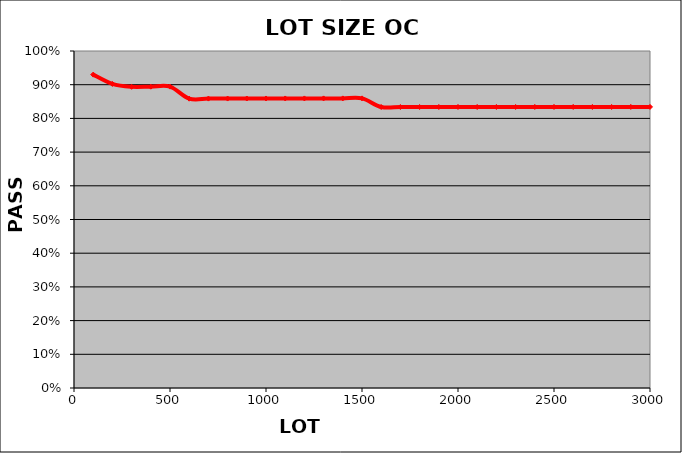
| Category | PASS
RATE |
|---|---|
| 100.0 | 0.93 |
| 200.0 | 0.902 |
| 300.0 | 0.894 |
| 400.0 | 0.894 |
| 500.0 | 0.894 |
| 600.0 | 0.859 |
| 700.0 | 0.859 |
| 800.0 | 0.859 |
| 900.0 | 0.859 |
| 1000.0 | 0.859 |
| 1100.0 | 0.859 |
| 1200.0 | 0.859 |
| 1300.0 | 0.859 |
| 1400.0 | 0.859 |
| 1500.0 | 0.859 |
| 1600.0 | 0.834 |
| 1700.0 | 0.834 |
| 1800.0 | 0.834 |
| 1900.0 | 0.834 |
| 2000.0 | 0.834 |
| 2100.0 | 0.834 |
| 2200.0 | 0.834 |
| 2300.0 | 0.834 |
| 2400.0 | 0.834 |
| 2500.0 | 0.834 |
| 2600.0 | 0.834 |
| 2700.0 | 0.834 |
| 2800.0 | 0.834 |
| 2900.0 | 0.834 |
| 3000.0 | 0.834 |